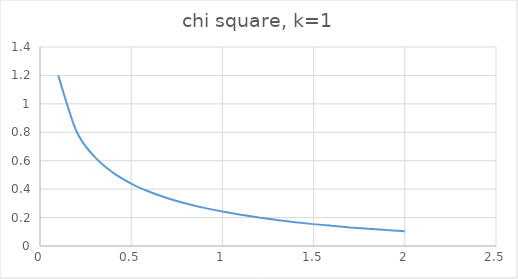
| Category | Series 0 |
|---|---|
| 0.1 | 1.2 |
| 0.2 | 0.807 |
| 0.3 | 0.627 |
| 0.4 | 0.516 |
| 0.5 | 0.439 |
| 0.6 | 0.382 |
| 0.7 | 0.336 |
| 0.8 | 0.299 |
| 0.9 | 0.268 |
| 1.0 | 0.242 |
| 1.1 | 0.219 |
| 1.2 | 0.2 |
| 1.3 | 0.183 |
| 1.4 | 0.167 |
| 1.5 | 0.154 |
| 1.6 | 0.142 |
| 1.7 | 0.131 |
| 1.8 | 0.121 |
| 1.9 | 0.112 |
| 2.0 | 0.104 |